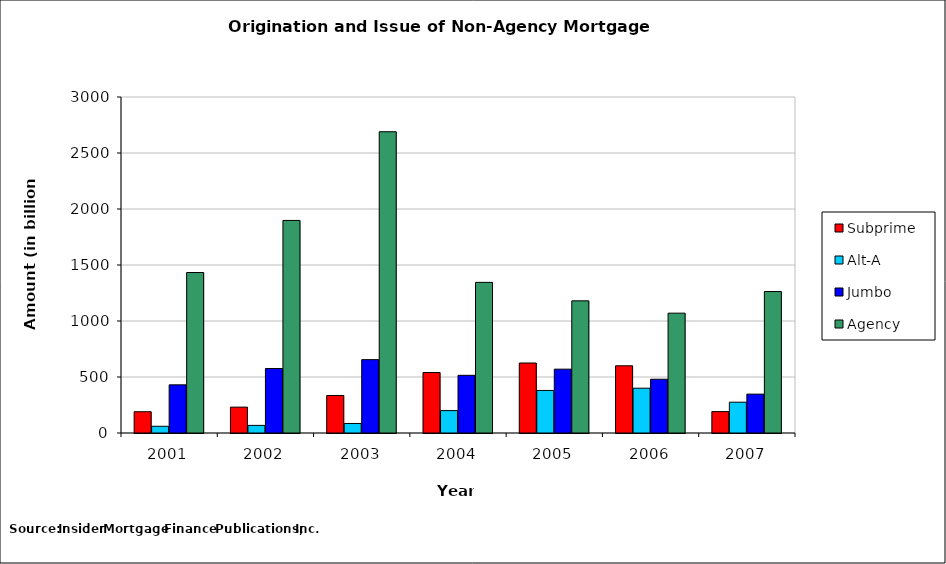
| Category | Subprime | Alt-A | Jumbo | Agency |
|---|---|---|---|---|
| 2001.0 | 190 | 60 | 430 | 1433 |
| 2002.0 | 231 | 68 | 576 | 1898 |
| 2003.0 | 335 | 85 | 655 | 2690 |
| 2004.0 | 540 | 200 | 515 | 1345 |
| 2005.0 | 625 | 380 | 570 | 1180 |
| 2006.0 | 600 | 400 | 480 | 1070 |
| 2007.0 | 191 | 275 | 347 | 1263 |